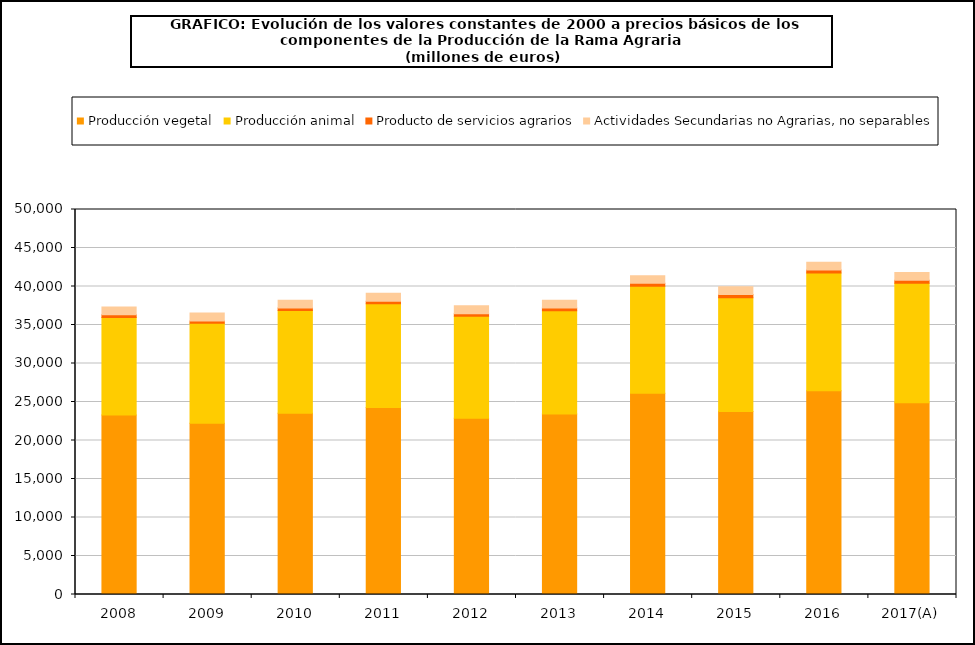
| Category | Producción vegetal | Producción animal | Producto de servicios agrarios | Actividades Secundarias no Agrarias, no separables |
|---|---|---|---|---|
| 2008 | 23322.7 | 12663.4 | 359.2 | 1000.2 |
| 2009 | 22241.2 | 12972.1 | 307.9 | 1025.1 |
| 2010 | 23535.5 | 13339.7 | 321.6 | 1033.4 |
| 2011 | 24269.6 | 13477 | 327.7 | 1034.7 |
| 2012 | 22902.1 | 13229.7 | 340.4 | 1032.7 |
| 2013 | 23433.2 | 13422.8 | 352 | 1014.7 |
| 2014 | 26123.1 | 13909.9 | 384 | 991.6 |
| 2015 | 23758.8 | 14795.1 | 402.1 | 1014.9 |
| 2016 | 26460.2 | 15288.9 | 399.1 | 1013.9 |
| 2017(A) | 24910.2 | 15513.3 | 394.7 | 1015.8 |